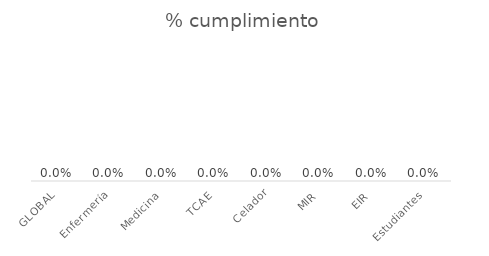
| Category | Series 0 |
|---|---|
| GLOBAL | 0 |
| Enfermería | 0 |
| Medicina | 0 |
| TCAE | 0 |
| Celador | 0 |
| MIR | 0 |
| EIR | 0 |
| Estudiantes | 0 |